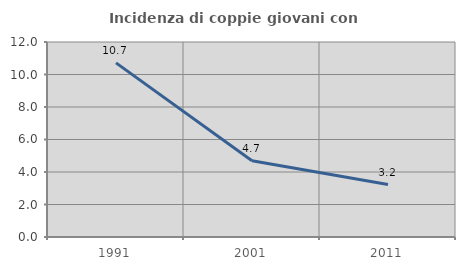
| Category | Incidenza di coppie giovani con figli |
|---|---|
| 1991.0 | 10.714 |
| 2001.0 | 4.688 |
| 2011.0 | 3.226 |